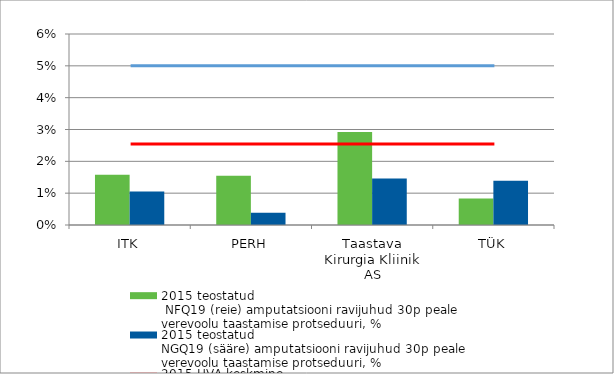
| Category | 2015 teostatud
 NFQ19 (reie) amputatsiooni ravijuhud 30p peale
verevoolu taastamise protseduuri, % | 2015 teostatud
NGQ19 (sääre) amputatsiooni ravijuhud 30p peale
verevoolu taastamise protseduuri, % |
|---|---|---|
| ITK | 0.016 | 0.011 |
| PERH | 0.016 | 0.004 |
| Taastava Kirurgia Kliinik AS | 0.029 | 0.015 |
| TÜK | 0.008 | 0.014 |